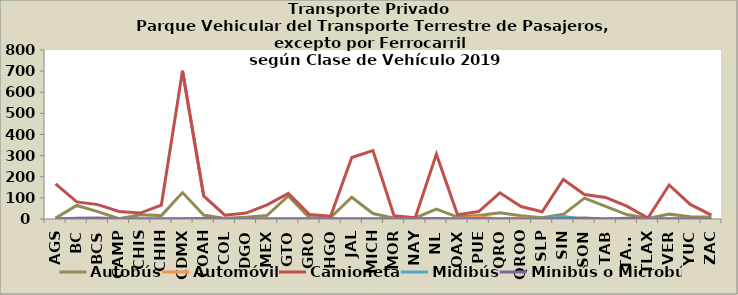
| Category | Autobús | Automóvil | Camioneta | Midibús | Minibús o Microbús |
|---|---|---|---|---|---|
| AGS | 4 | 0 | 166 | 0 | 0 |
| BC | 64 | 1 | 81 | 1 | 3 |
| BCS | 35 | 0 | 68 | 1 | 5 |
| CAMP | 1 | 2 | 36 | 0 | 0 |
| CHIS | 20 | 0 | 28 | 0 | 0 |
| CHIH | 16 | 0 | 66 | 0 | 0 |
| CDMX | 125 | 2 | 702 | 0 | 0 |
| COAH | 19 | 0 | 109 | 0 | 2 |
| COL | 3 | 0 | 18 | 0 | 0 |
| DGO | 8 | 0 | 28 | 0 | 0 |
| MEX | 17 | 0 | 67 | 0 | 0 |
| GTO | 109 | 0 | 121 | 0 | 0 |
| GRO | 6 | 1 | 21 | 0 | 0 |
| HGO | 7 | 0 | 13 | 0 | 0 |
| JAL | 103 | 0 | 291 | 0 | 0 |
| MICH | 26 | 0 | 324 | 0 | 0 |
| MOR | 4 | 0 | 15 | 0 | 0 |
| NAY | 5 | 0 | 6 | 0 | 0 |
| NL | 47 | 0 | 307 | 0 | 2 |
| OAX | 9 | 0 | 20 | 0 | 0 |
| PUE | 17 | 10 | 35 | 0 | 1 |
| QRO | 30 | 0 | 124 | 0 | 0 |
| QROO | 15 | 5 | 59 | 0 | 0 |
| SLP | 6 | 0 | 34 | 0 | 0 |
| SIN | 22 | 1 | 187 | 12 | 1 |
| SON | 99 | 5 | 116 | 0 | 4 |
| TAB | 60 | 0 | 102 | 0 | 0 |
| TAMS | 21 | 0 | 61 | 0 | 3 |
| TLAX | 2 | 0 | 5 | 0 | 0 |
| VER | 23 | 1 | 161 | 0 | 0 |
| YUC | 11 | 0 | 69 | 0 | 1 |
| ZAC | 10 | 0 | 18 | 0 | 0 |